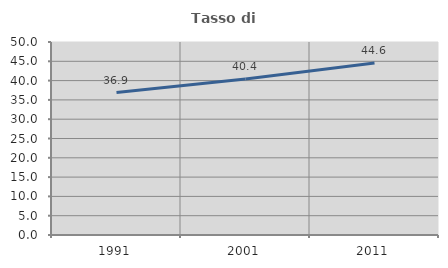
| Category | Tasso di occupazione   |
|---|---|
| 1991.0 | 36.903 |
| 2001.0 | 40.389 |
| 2011.0 | 44.576 |